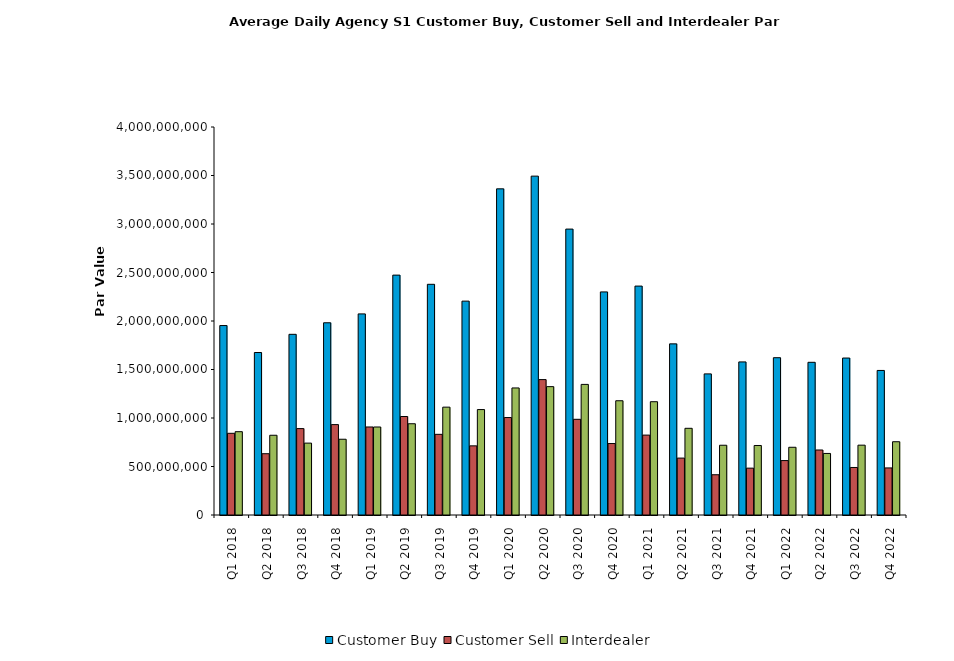
| Category | Customer Buy | Customer Sell | Interdealer |
|---|---|---|---|
| Q1 2018 | 1953070289.161 | 842225728.237 | 858924653.267 |
| Q2 2018 | 1675130757.897 | 631829280.343 | 822052220.44 |
| Q3 2018 | 1862749665.292 | 890746088.764 | 740998328.027 |
| Q4 2018 | 1981793898.347 | 931891609.234 | 780997176.341 |
| Q1 2019 | 2073261289.88 | 907510641.636 | 907260794.476 |
| Q2 2019 | 2473016544.594 | 1015360883.633 | 940855570.046 |
| Q3 2019 | 2378240723.661 | 831622963.177 | 1111864355.118 |
| Q4 2019 | 2204844278.563 | 712918478.978 | 1086841151.009 |
| Q1 2020 | 3362551755.186 | 1004751117.532 | 1309827535.649 |
| Q2 2020 | 3493551277.386 | 1395918416.507 | 1323386792.52 |
| Q3 2020 | 2947577049.279 | 986470577.23 | 1346329562.976 |
| Q4 2020 | 2299861782.395 | 736719021.503 | 1177913333.868 |
| Q1 2021 | 2359997883.405 | 823688579.746 | 1167873739.582 |
| Q2 2021 | 1764193861.289 | 586671797.083 | 893791433.931 |
| Q3 2021 | 1454835444.617 | 415056304.899 | 719075537.285 |
| Q4 2021 | 1578222361.26 | 483014882.953 | 716584342.958 |
| Q1 2022 | 1621678828.378 | 561118720.592 | 698191226.356 |
| Q2 2022 | 1574211173.599 | 670203829.293 | 634597449.719 |
| Q3 2022 | 1618094858.503 | 489928924.408 | 719984663.767 |
| Q4 2022 | 1490322906.815 | 485222833.849 | 755328901.37 |